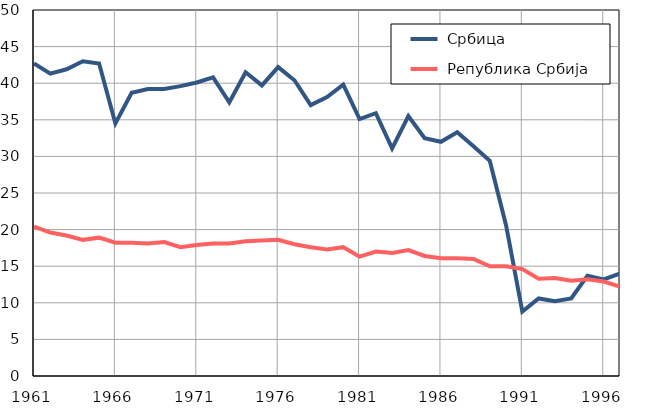
| Category |  Србица |  Република Србија |
|---|---|---|
| 1961.0 | 42.7 | 20.4 |
| 1962.0 | 41.3 | 19.6 |
| 1963.0 | 41.9 | 19.2 |
| 1964.0 | 43 | 18.6 |
| 1965.0 | 42.7 | 18.9 |
| 1966.0 | 34.5 | 18.2 |
| 1967.0 | 38.7 | 18.2 |
| 1968.0 | 39.2 | 18.1 |
| 1969.0 | 39.2 | 18.3 |
| 1970.0 | 39.6 | 17.6 |
| 1971.0 | 40.1 | 17.9 |
| 1972.0 | 40.8 | 18.1 |
| 1973.0 | 37.4 | 18.1 |
| 1974.0 | 41.5 | 18.4 |
| 1975.0 | 39.7 | 18.5 |
| 1976.0 | 42.2 | 18.6 |
| 1977.0 | 40.4 | 18 |
| 1978.0 | 37 | 17.6 |
| 1979.0 | 38.1 | 17.3 |
| 1980.0 | 39.8 | 17.6 |
| 1981.0 | 35.1 | 16.3 |
| 1982.0 | 35.9 | 17 |
| 1983.0 | 31.1 | 16.8 |
| 1984.0 | 35.5 | 17.2 |
| 1985.0 | 32.5 | 16.4 |
| 1986.0 | 32 | 16.1 |
| 1987.0 | 33.3 | 16.1 |
| 1988.0 | 31.4 | 16 |
| 1989.0 | 29.4 | 15 |
| 1990.0 | 20.6 | 15 |
| 1991.0 | 8.8 | 14.6 |
| 1992.0 | 10.6 | 13.3 |
| 1993.0 | 10.2 | 13.4 |
| 1994.0 | 10.6 | 13 |
| 1995.0 | 13.7 | 13.2 |
| 1996.0 | 13.2 | 12.9 |
| 1997.0 | 14 | 12.2 |